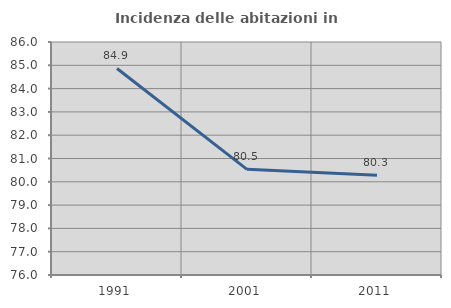
| Category | Incidenza delle abitazioni in proprietà  |
|---|---|
| 1991.0 | 84.865 |
| 2001.0 | 80.534 |
| 2011.0 | 80.277 |